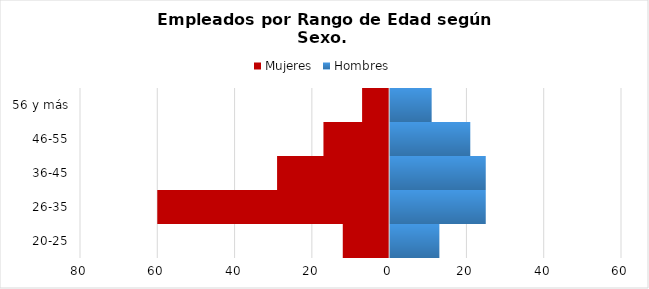
| Category | Mujeres | Hombres |
|---|---|---|
| 20-25 | -12 | 13 |
| 26-35 | -60 | 25 |
| 36-45 | -29 | 25 |
| 46-55 | -17 | 21 |
| 56 y más | -7 | 11 |